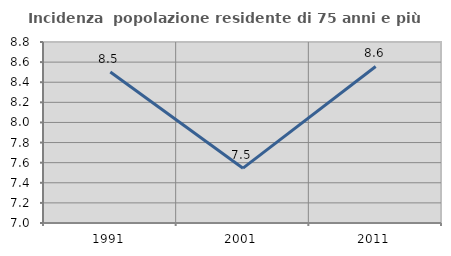
| Category | Incidenza  popolazione residente di 75 anni e più |
|---|---|
| 1991.0 | 8.502 |
| 2001.0 | 7.545 |
| 2011.0 | 8.557 |